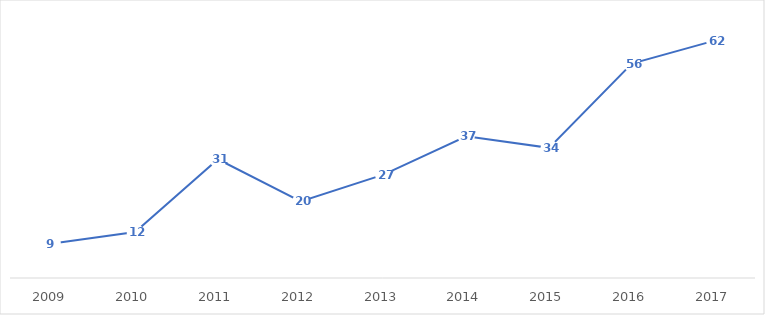
| Category | Series 0 |
|---|---|
| 2009.0 | 9 |
| 2010.0 | 12 |
| 2011.0 | 31 |
| 2012.0 | 20 |
| 2013.0 | 27 |
| 2014.0 | 37 |
| 2015.0 | 34 |
| 2016.0 | 56 |
| 2017.0 | 62 |